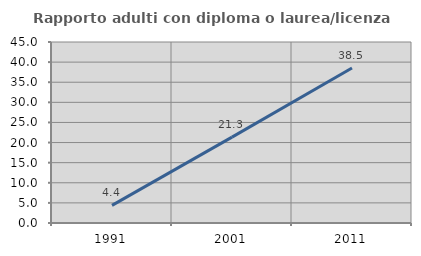
| Category | Rapporto adulti con diploma o laurea/licenza media  |
|---|---|
| 1991.0 | 4.378 |
| 2001.0 | 21.346 |
| 2011.0 | 38.531 |